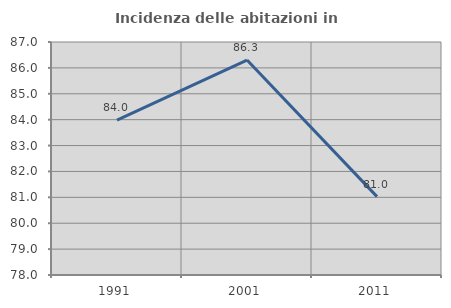
| Category | Incidenza delle abitazioni in proprietà  |
|---|---|
| 1991.0 | 83.982 |
| 2001.0 | 86.301 |
| 2011.0 | 81.027 |